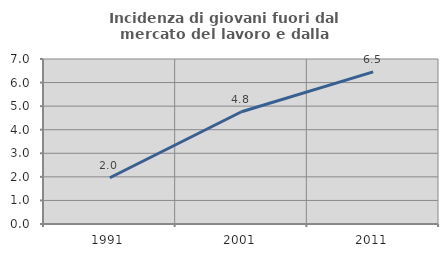
| Category | Incidenza di giovani fuori dal mercato del lavoro e dalla formazione  |
|---|---|
| 1991.0 | 1.961 |
| 2001.0 | 4.762 |
| 2011.0 | 6.452 |